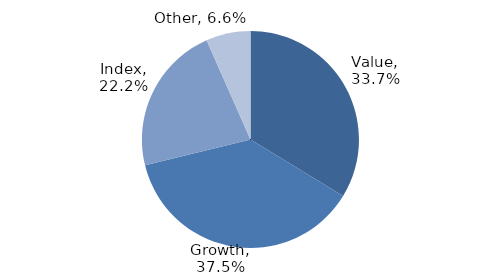
| Category | Investment Style |
|---|---|
| Value | 0.337 |
| Growth | 0.375 |
| Index | 0.222 |
| Other | 0.066 |